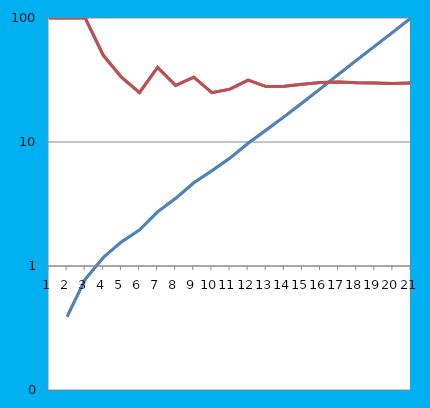
| Category | Series 2 | Series 3 | Series 0 | Series 1 |
|---|---|---|---|---|
| 0 | 0 | 100 | 0 | 100 |
| 1 | 0.391 | 100 | 0.391 | 100 |
| 2 | 0.781 | 100 | 0.781 | 100 |
| 3 | 1.172 | 50 | 1.172 | 50 |
| 4 | 1.562 | 33.333 | 1.562 | 33.333 |
| 5 | 1.953 | 25 | 1.953 | 25 |
| 6 | 2.734 | 40 | 2.734 | 40 |
| 7 | 3.516 | 28.571 | 3.516 | 28.571 |
| 8 | 4.688 | 33.333 | 4.688 | 33.333 |
| 9 | 5.859 | 25 | 5.859 | 25 |
| 10 | 7.422 | 26.667 | 7.422 | 26.667 |
| 11 | 9.766 | 31.579 | 9.766 | 31.579 |
| 12 | 12.5 | 28 | 12.5 | 28 |
| 13 | 16.016 | 28.125 | 16.016 | 28.125 |
| 14 | 20.703 | 29.268 | 20.703 | 29.268 |
| 15 | 26.953 | 30.189 | 26.953 | 30.189 |
| 16 | 35.156 | 30.435 | 35.156 | 30.435 |
| 17 | 45.703 | 30 | 45.703 | 30 |
| 18 | 59.375 | 29.915 | 59.375 | 29.915 |
| 19 | 76.953 | 29.605 | 76.953 | 29.605 |
| 20 | 100 | 29.949 | 100 | 29.949 |